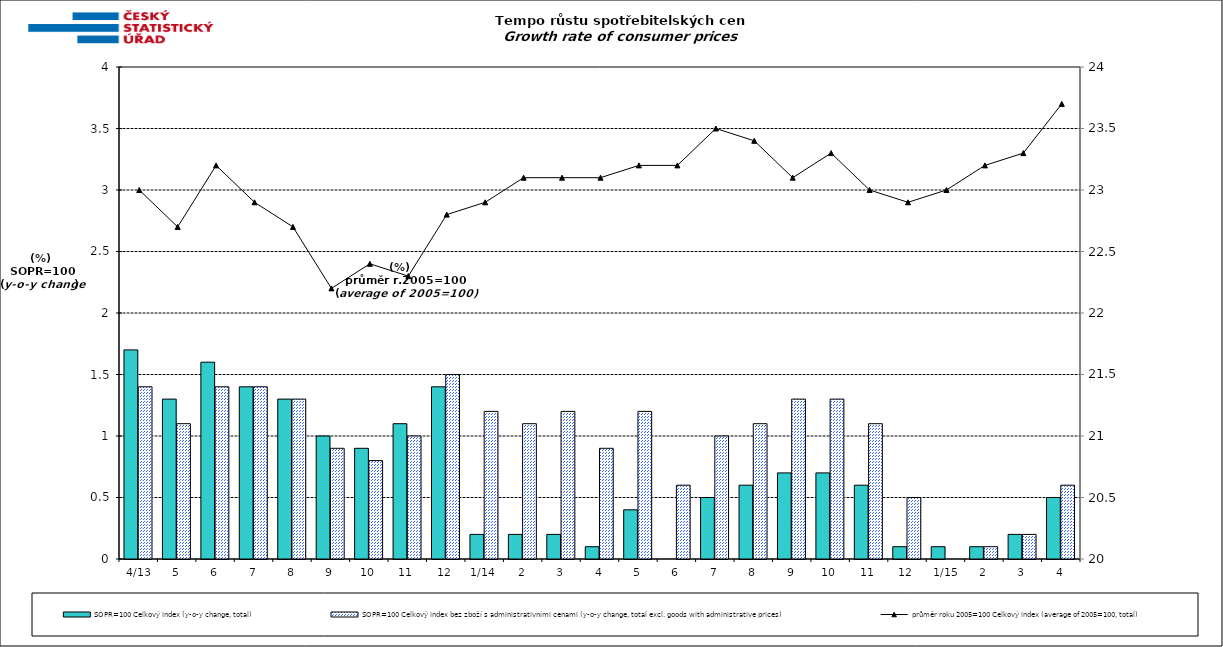
| Category | SOPR=100 Celkový index (y-o-y change, total) | SOPR=100 Celkový index bez zboží s administrativními cenami (y-o-y change, total excl. goods with administrative prices)  |
|---|---|---|
|  4/13 | 1.7 | 1.4 |
| 5 | 1.3 | 1.1 |
| 6 | 1.6 | 1.4 |
| 7 | 1.4 | 1.4 |
| 8 | 1.3 | 1.3 |
| 9 | 1 | 0.9 |
| 10 | 0.9 | 0.8 |
| 11 | 1.1 | 1 |
| 12 | 1.4 | 1.5 |
| 1/14 | 0.2 | 1.2 |
| 2 | 0.2 | 1.1 |
| 3 | 0.2 | 1.2 |
| 4 | 0.1 | 0.9 |
| 5 | 0.4 | 1.2 |
| 6 | 0 | 0.6 |
| 7 | 0.5 | 1 |
| 8 | 0.6 | 1.1 |
| 9 | 0.7 | 1.3 |
| 10 | 0.7 | 1.3 |
| 11 | 0.6 | 1.1 |
| 12 | 0.1 | 0.5 |
|  1/15 | 0.1 | 0 |
| 2 | 0.1 | 0.1 |
| 3 | 0.2 | 0.2 |
| 4 | 0.5 | 0.6 |